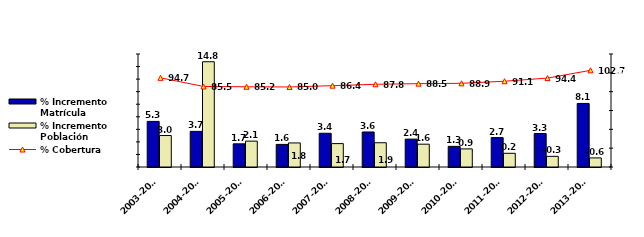
| Category | % Incremento Matrícula | % Incremento Población |
|---|---|---|
| 2005-2006 | 1.693 | 2.12 |
| 2006-2007 | 1.599 | 1.834 |
| 2007-2008 | 3.373 | 1.727 |
| 2008-2009 | 3.578 | 1.865 |
| 2009-2010 | 2.441 | 1.634 |
| 2010-2011 | 1.287 | 0.884 |
| 2011-2012 | 2.689 | 0.18 |
| 2012-2013 | 3.332 | -0.304 |
| 2013-2014 | 8.124 | -0.553 |